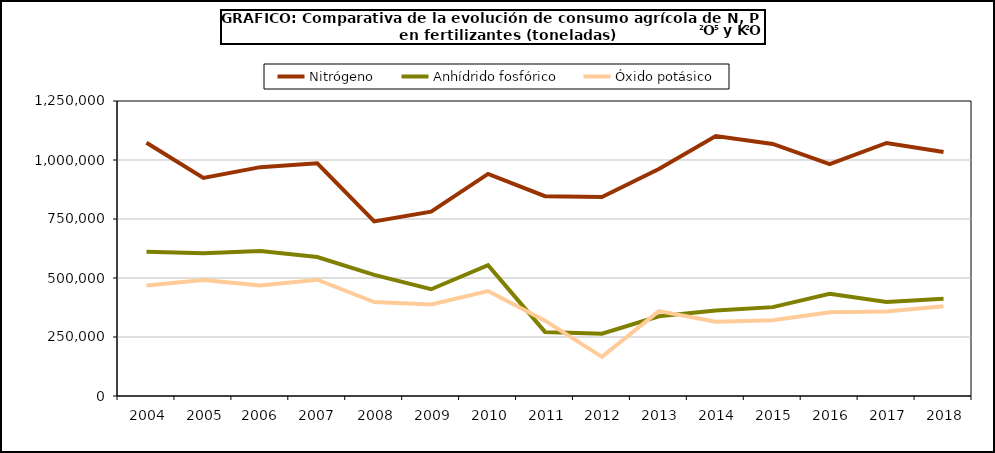
| Category | Nitrógeno | Anhídrido fosfórico | Óxido potásico |
|---|---|---|---|
|   2004 | 1072949 |  |  |
|   2005 | 923764 |  |  |
|   2006  | 969783 |  |  |
|   2007  | 985857 |  |  |
|   2008 | 739757 |  |  |
|   2009 | 781069 |  |  |
|   2010 | 940984 |  |  |
|   2011 | 846697 |  |  |
|   2012 | 843410 |  |  |
|   2013 | 961507 |  |  |
|   2014 | 1101895 |  |  |
|   2015 | 1068103 |  |  |
|   2016 | 982155 |  |  |
|   2017 | 1072125 |  |  |
|   2018 | 1033494 |  |  |